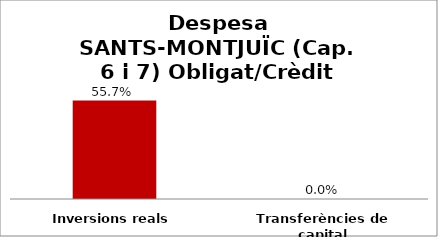
| Category | Series 0 |
|---|---|
| Inversions reals | 0.557 |
| Transferències de capital | 0 |